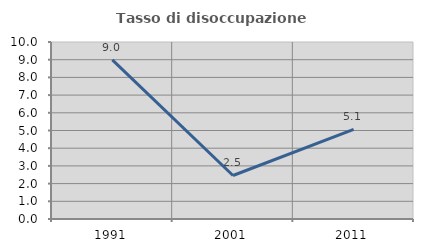
| Category | Tasso di disoccupazione giovanile  |
|---|---|
| 1991.0 | 8.993 |
| 2001.0 | 2.459 |
| 2011.0 | 5.063 |